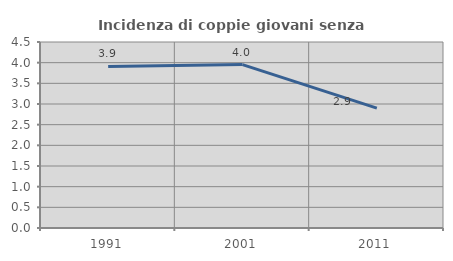
| Category | Incidenza di coppie giovani senza figli |
|---|---|
| 1991.0 | 3.908 |
| 2001.0 | 3.953 |
| 2011.0 | 2.901 |